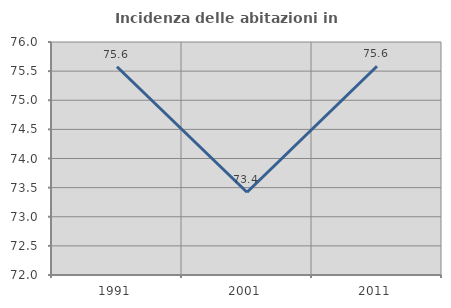
| Category | Incidenza delle abitazioni in proprietà  |
|---|---|
| 1991.0 | 75.575 |
| 2001.0 | 73.421 |
| 2011.0 | 75.584 |